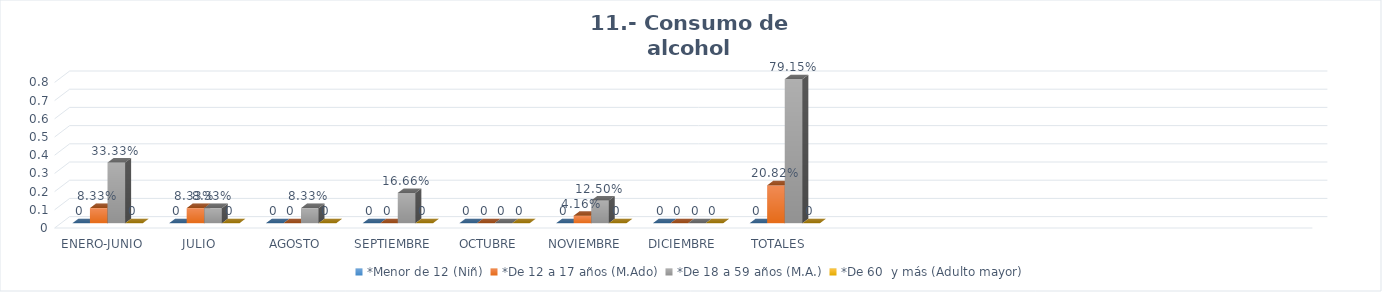
| Category | *Menor de 12 (Niñ) | *De 12 a 17 años (M.Ado) | *De 18 a 59 años (M.A.) | *De 60  y más (Adulto mayor) |
|---|---|---|---|---|
| ENERO-JUNIO | 0 | 0.083 | 0.333 | 0 |
| JULIO | 0 | 0.083 | 0.083 | 0 |
| AGOSTO | 0 | 0 | 0.083 | 0 |
| SEPTIEMBRE | 0 | 0 | 0.167 | 0 |
| OCTUBRE | 0 | 0 | 0 | 0 |
| NOVIEMBRE | 0 | 0.042 | 0.125 | 0 |
| DICIEMBRE | 0 | 0 | 0 | 0 |
| TOTALES | 0 | 0.208 | 0.792 | 0 |